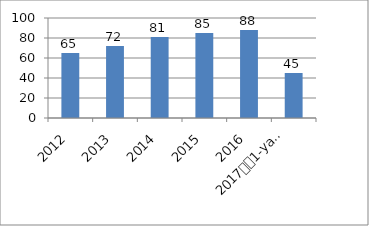
| Category | Series 0 |
|---|---|
| 2012 | 65 |
| 2013 | 72 |
| 2014 | 81 |
| 2015 | 85 |
| 2016 | 88 |
| 2017
1-yarim yillik | 45 |